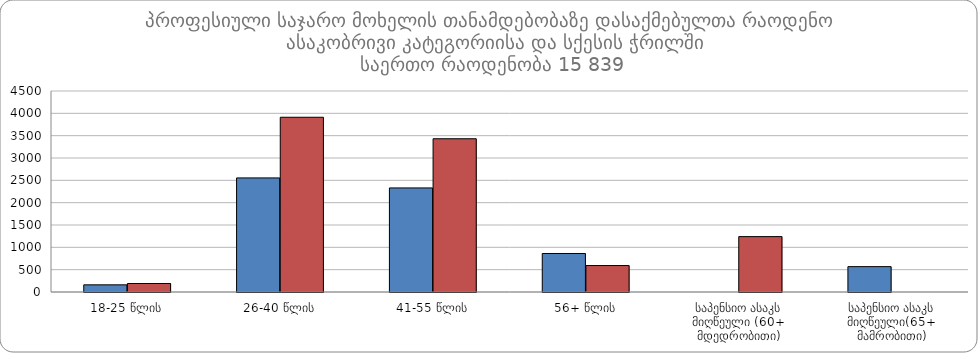
| Category |  მამრობითი |  მდედრობითი |
|---|---|---|
| 18-25 წლის | 160 | 190 |
| 26-40 წლის | 2554 | 3912 |
| 41-55 წლის | 2330 | 3431 |
| 56+ წლის | 862 | 592 |
| საპენსიო ასაკს მიღწეული (60+ მდედრობითი) | 0 | 1240 |
| საპენსიო ასაკს მიღწეული(65+ მამრობითი) | 568 | 0 |